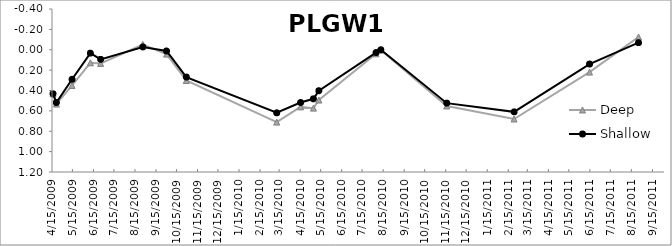
| Category | Deep | Shallow |
|---|---|---|
| 4/16/09 | 0.433 | 0.433 |
| 4/21/09 | 0.533 | 0.518 |
| 5/14/09 | 0.351 | 0.29 |
| 6/10/09 | 0.128 | 0.034 |
| 6/25/09 | 0.134 | 0.094 |
| 8/26/09 | -0.052 | -0.027 |
| 9/30/09 | 0.043 | 0.012 |
| 10/29/09 | 0.302 | 0.268 |
| 3/11/10 | 0.71 | 0.619 |
| 4/15/10 | 0.561 | 0.518 |
| 5/4/10 | 0.573 | 0.482 |
| 5/12/10 | 0.494 | 0.402 |
| 8/4/10 | 0.04 | 0.027 |
| 8/11/10 | 0.003 | 0 |
| 11/16/10 | 0.552 | 0.524 |
| 2/23/11 | 0.68 | 0.61 |
| 6/14/11 | 0.219 | 0.14 |
| 8/25/11 | -0.125 | -0.07 |